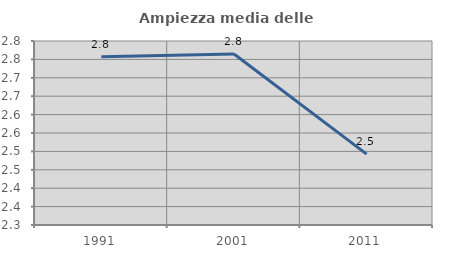
| Category | Ampiezza media delle famiglie |
|---|---|
| 1991.0 | 2.757 |
| 2001.0 | 2.765 |
| 2011.0 | 2.493 |